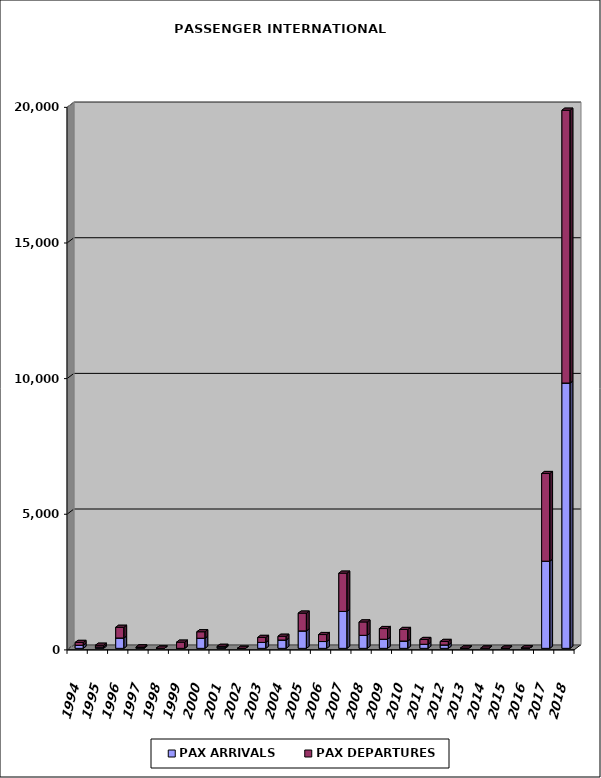
| Category | PAX ARRIVALS | PAX DEPARTURES |
|---|---|---|
| 1994.0 | 113 | 105 |
| 1995.0 | 50 | 64 |
| 1996.0 | 381 | 394 |
| 1997.0 | 38 | 10 |
| 1998.0 | 4 | 0 |
| 1999.0 | 0 | 227 |
| 2000.0 | 372 | 239 |
| 2001.0 | 52 | 22 |
| 2002.0 | 0 | 0 |
| 2003.0 | 219 | 183 |
| 2004.0 | 306 | 139 |
| 2005.0 | 642 | 656 |
| 2006.0 | 251 | 257 |
| 2007.0 | 1362 | 1408 |
| 2008.0 | 480 | 493 |
| 2009.0 | 335 | 394 |
| 2010.0 | 269 | 426 |
| 2011.0 | 150 | 176 |
| 2012.0 | 125 | 129 |
| 2013.0 | 0 | 10 |
| 2014.0 | 0 | 6 |
| 2015.0 | 0 | 8 |
| 2016.0 | 3 | 14 |
| 2017.0 | 3213 | 3231 |
| 2018.0 | 9780 | 10056 |